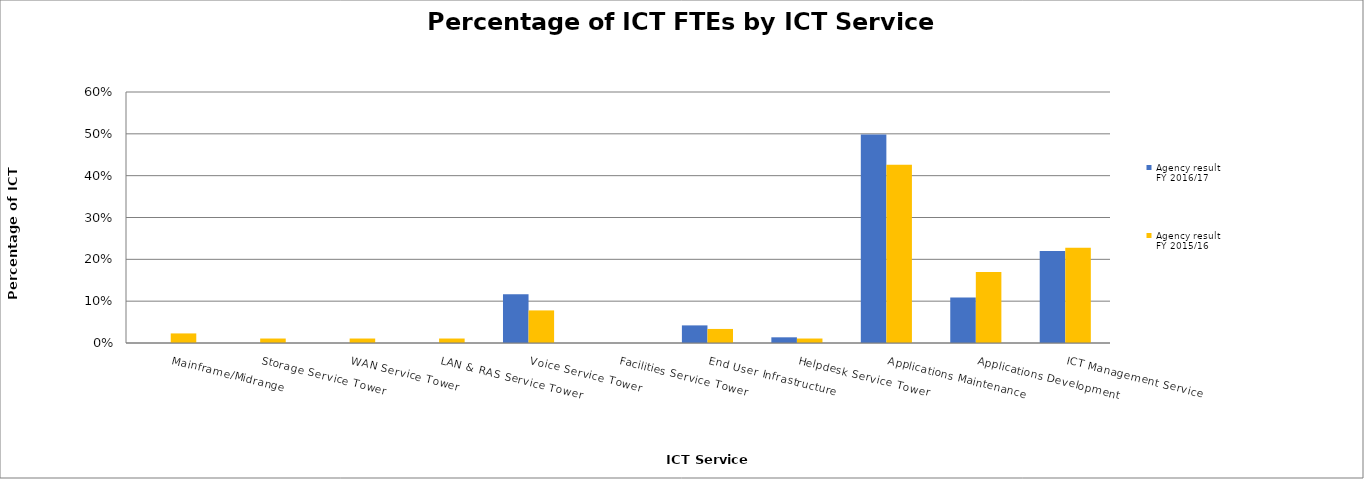
| Category | Agency result
FY 2016/17 | Agency result
FY 2015/16 |
|---|---|---|
| Mainframe/Midrange | 0 | 0.023 |
| Storage Service Tower | 0 | 0.011 |
| WAN Service Tower | 0 | 0.011 |
| LAN & RAS Service Tower | 0 | 0.011 |
| Voice Service Tower | 0.117 | 0.078 |
| Facilities Service Tower | 0 | 0 |
| End User Infrastructure | 0.042 | 0.034 |
| Helpdesk Service Tower | 0.014 | 0.011 |
| Applications Maintenance | 0.499 | 0.426 |
| Applications Development | 0.109 | 0.17 |
| ICT Management Service | 0.22 | 0.228 |